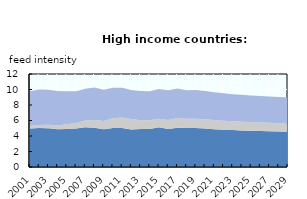
| Category | High protein feed | Medium protein feed | Low protein feed |
|---|---|---|---|
| 2001.0 | 4.954 | 0.321 | 4.503 |
| 2002.0 | 5.042 | 0.387 | 4.564 |
| 2003.0 | 4.995 | 0.446 | 4.535 |
| 2004.0 | 4.887 | 0.499 | 4.412 |
| 2005.0 | 4.898 | 0.614 | 4.269 |
| 2006.0 | 4.98 | 0.709 | 4.088 |
| 2007.0 | 5.114 | 0.876 | 4.101 |
| 2008.0 | 5.061 | 0.995 | 4.21 |
| 2009.0 | 4.859 | 1.068 | 4.034 |
| 2010.0 | 5.044 | 1.249 | 3.948 |
| 2011.0 | 5.045 | 1.331 | 3.835 |
| 2012.0 | 4.833 | 1.35 | 3.749 |
| 2013.0 | 4.891 | 1.125 | 3.798 |
| 2014.0 | 4.914 | 1.119 | 3.742 |
| 2015.0 | 5.123 | 1.106 | 3.832 |
| 2016.0 | 4.895 | 1.172 | 3.821 |
| 2017.0 | 5.081 | 1.257 | 3.776 |
| 2018.0 | 5.024 | 1.203 | 3.687 |
| 2019.0 | 5.045 | 1.187 | 3.716 |
| 2020.0 | 4.957 | 1.2 | 3.656 |
| 2021.0 | 4.887 | 1.18 | 3.582 |
| 2022.0 | 4.812 | 1.156 | 3.533 |
| 2023.0 | 4.766 | 1.133 | 3.494 |
| 2024.0 | 4.72 | 1.122 | 3.467 |
| 2025.0 | 4.682 | 1.109 | 3.446 |
| 2026.0 | 4.646 | 1.097 | 3.425 |
| 2027.0 | 4.615 | 1.089 | 3.406 |
| 2028.0 | 4.582 | 1.076 | 3.387 |
| 2029.0 | 4.548 | 1.066 | 3.367 |